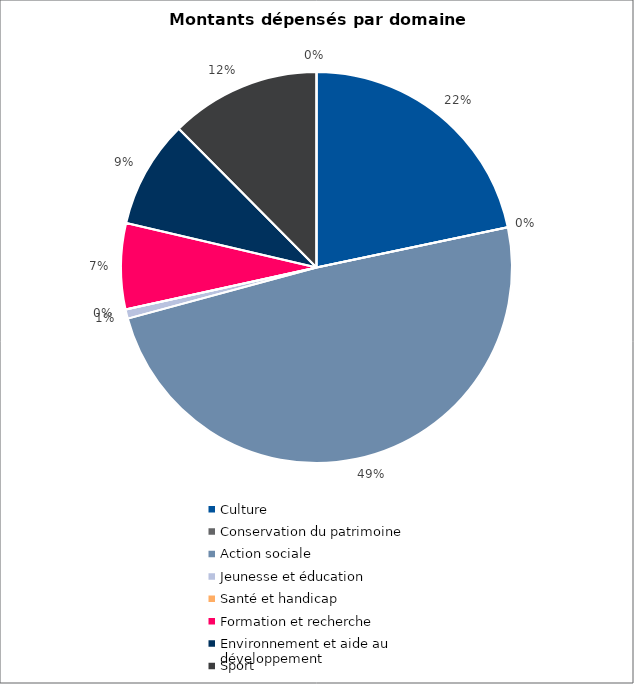
| Category | Series 0 |
|---|---|
| Culture | 122000 |
| Conservation du patrimoine | 0 |
| Action sociale | 276000 |
| Jeunesse et éducation | 4255 |
| Santé et handicap | 0 |
| Formation et recherche | 40000 |
| Environnement et aide au
développement | 50000 |
| Sport | 70000 |
| Autres projets d’utilité publique | 0 |